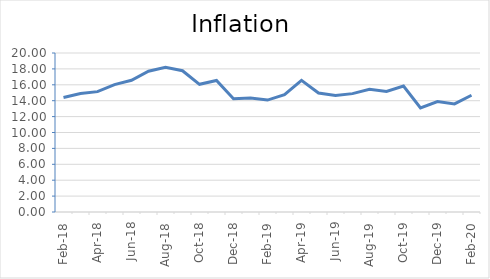
| Category | Inflation |
|---|---|
| 2018-02-01 | 14.4 |
| 2018-03-01 | 14.91 |
| 2018-04-01 | 15.14 |
| 2018-05-01 | 16.02 |
| 2018-06-01 | 16.57 |
| 2018-07-01 | 17.71 |
| 2018-08-01 | 18.19 |
| 2018-09-01 | 17.77 |
| 2018-10-01 | 16.06 |
| 2018-11-01 | 16.55 |
| 2018-12-01 | 14.25 |
| 2019-01-01 | 14.35 |
| 2019-02-01 | 14.08 |
| 2019-03-01 | 14.77 |
| 2019-04-01 | 16.56 |
| 2019-05-01 | 14.97 |
| 2019-06-01 | 14.65 |
| 2019-07-01 | 14.89 |
| 2019-08-01 | 15.43 |
| 2019-09-01 | 15.16 |
| 2019-10-01 | 15.85 |
| 2019-11-01 | 13.09 |
| 2019-12-01 | 13.89 |
| 2020-01-01 | 13.6 |
| 2020-02-01 | 14.69 |